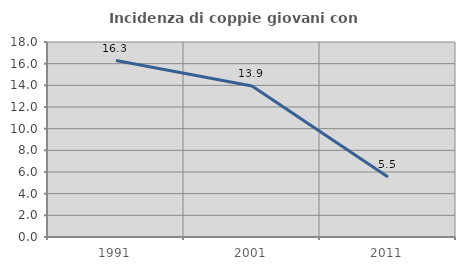
| Category | Incidenza di coppie giovani con figli |
|---|---|
| 1991.0 | 16.288 |
| 2001.0 | 13.937 |
| 2011.0 | 5.534 |